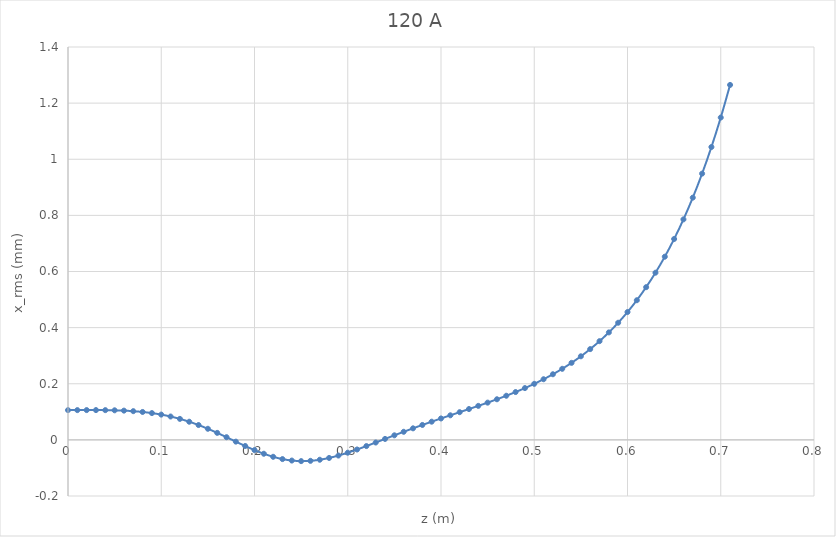
| Category | Series 0 |
|---|---|
| 0.0 | 0.106 |
| 0.01 | 0.106 |
| 0.02 | 0.106 |
| 0.03 | 0.106 |
| 0.04 | 0.106 |
| 0.05 | 0.105 |
| 0.06 | 0.104 |
| 0.07 | 0.102 |
| 0.08 | 0.099 |
| 0.09 | 0.095 |
| 0.1 | 0.09 |
| 0.11 | 0.083 |
| 0.12 | 0.075 |
| 0.13 | 0.065 |
| 0.14 | 0.053 |
| 0.15 | 0.04 |
| 0.16 | 0.025 |
| 0.17 | 0.01 |
| 0.18 | -0.006 |
| 0.19 | -0.022 |
| 0.2 | -0.036 |
| 0.21 | -0.049 |
| 0.22 | -0.06 |
| 0.23 | -0.068 |
| 0.24 | -0.074 |
| 0.25 | -0.076 |
| 0.26 | -0.075 |
| 0.27 | -0.071 |
| 0.28 | -0.064 |
| 0.29 | -0.056 |
| 0.3 | -0.046 |
| 0.31 | -0.034 |
| 0.32 | -0.022 |
| 0.33 | -0.009 |
| 0.34 | 0.003 |
| 0.35 | 0.016 |
| 0.36 | 0.029 |
| 0.37 | 0.041 |
| 0.38 | 0.053 |
| 0.39 | 0.065 |
| 0.4 | 0.076 |
| 0.41 | 0.088 |
| 0.42 | 0.099 |
| 0.43 | 0.11 |
| 0.44 | 0.121 |
| 0.45 | 0.133 |
| 0.46 | 0.145 |
| 0.47 | 0.157 |
| 0.48 | 0.17 |
| 0.49 | 0.185 |
| 0.5 | 0.2 |
| 0.51 | 0.216 |
| 0.52 | 0.234 |
| 0.53 | 0.253 |
| 0.54 | 0.274 |
| 0.55 | 0.298 |
| 0.56 | 0.323 |
| 0.57 | 0.352 |
| 0.58 | 0.383 |
| 0.59 | 0.417 |
| 0.6 | 0.455 |
| 0.61 | 0.498 |
| 0.62 | 0.544 |
| 0.63 | 0.596 |
| 0.64 | 0.653 |
| 0.65 | 0.716 |
| 0.66 | 0.786 |
| 0.67 | 0.863 |
| 0.68 | 0.949 |
| 0.69 | 1.044 |
| 0.7 | 1.149 |
| 0.71 | 1.265 |